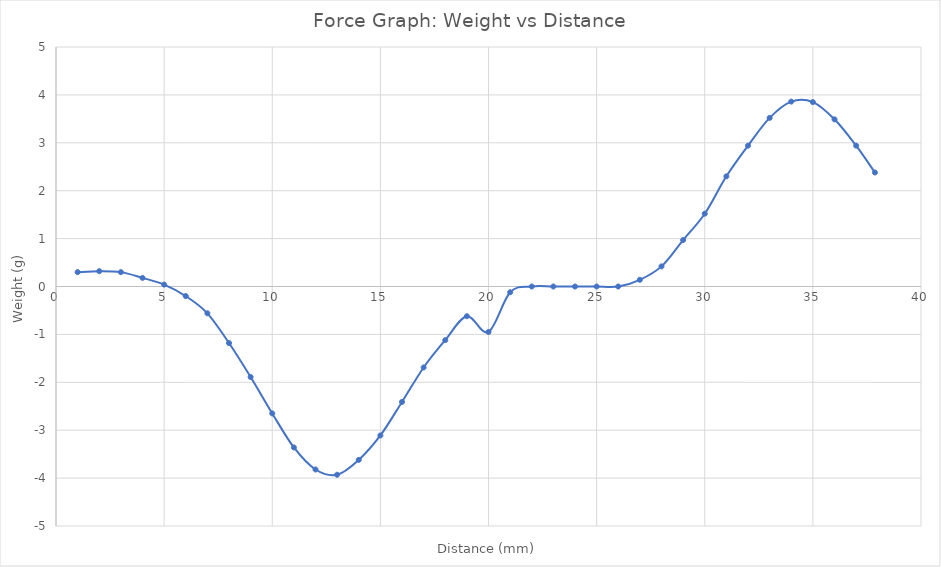
| Category | Weight (g) |
|---|---|
| 1.0 | 0.3 |
| 2.0 | 0.32 |
| 3.0 | 0.3 |
| 4.0 | 0.18 |
| 5.0 | 0.04 |
| 6.0 | -0.2 |
| 7.0 | -0.56 |
| 8.0 | -1.18 |
| 9.0 | -1.89 |
| 10.0 | -2.65 |
| 11.0 | -3.36 |
| 12.0 | -3.82 |
| 13.0 | -3.93 |
| 14.0 | -3.62 |
| 15.0 | -3.11 |
| 16.0 | -2.41 |
| 17.0 | -1.69 |
| 18.0 | -1.12 |
| 19.0 | -0.62 |
| 20.0 | -0.95 |
| 21.0 | -0.12 |
| 22.0 | 0 |
| 23.0 | 0 |
| 24.0 | 0 |
| 25.0 | 0 |
| 26.0 | 0 |
| 27.0 | 0.14 |
| 28.0 | 0.42 |
| 29.0 | 0.97 |
| 30.0 | 1.52 |
| 31.0 | 2.3 |
| 32.0 | 2.94 |
| 33.0 | 3.52 |
| 34.0 | 3.86 |
| 35.0 | 3.85 |
| 36.0 | 3.49 |
| 37.0 | 2.94 |
| 37.87 | 2.38 |